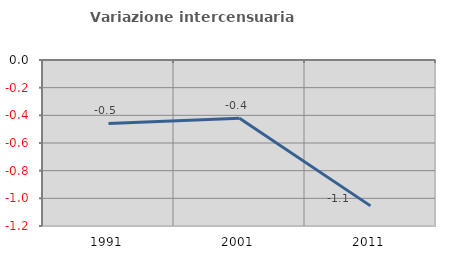
| Category | Variazione intercensuaria annua |
|---|---|
| 1991.0 | -0.459 |
| 2001.0 | -0.422 |
| 2011.0 | -1.055 |